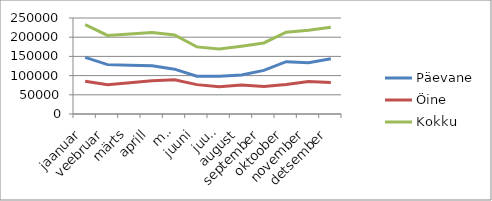
| Category | Päevane | Öine | Kokku |
|---|---|---|---|
| jaanuar | 147296.9 | 85241.6 | 232538.5 |
| veebruar | 128573.1 | 75986.5 | 204559.6 |
| märts | 126958.9 | 81553.4 | 208512.3 |
| aprill | 125424.8 | 86655 | 212079.8 |
| mai | 116748.8 | 89062.5 | 205811.3 |
| juuni | 98294.7 | 76508.9 | 174803.6 |
| juuli | 98063.2 | 71022.3 | 169085.5 |
| august | 101441.5 | 75240.9 | 176682.4 |
| september | 113557.9 | 71495.9 | 185053.8 |
| oktoober | 136187.3 | 76671.9 | 212859.2 |
| november | 133779.1 | 84606.7 | 218385.8 |
| detsember | 143817.4 | 82099.1 | 225916.5 |